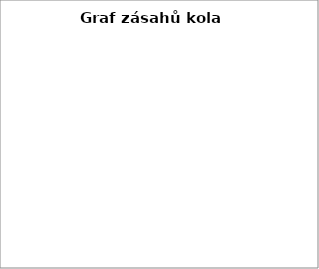
| Category | Series 0 |
|---|---|
| 5.0 | 0 |
| 4.0 | 0 |
| 3.0 | 0 |
| 2.0 | 0 |
| 1.0 | 0 |
| 0.0 | 0 |